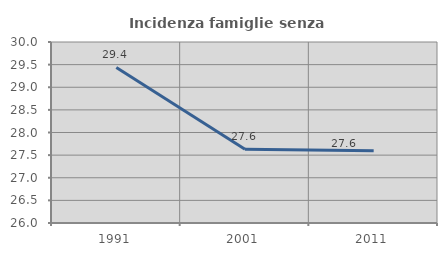
| Category | Incidenza famiglie senza nuclei |
|---|---|
| 1991.0 | 29.439 |
| 2001.0 | 27.631 |
| 2011.0 | 27.595 |